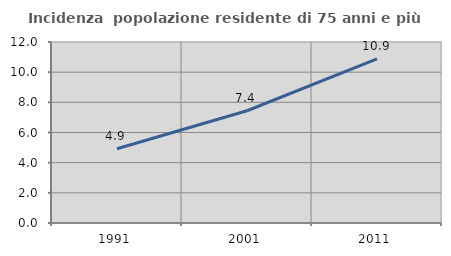
| Category | Incidenza  popolazione residente di 75 anni e più |
|---|---|
| 1991.0 | 4.921 |
| 2001.0 | 7.442 |
| 2011.0 | 10.883 |